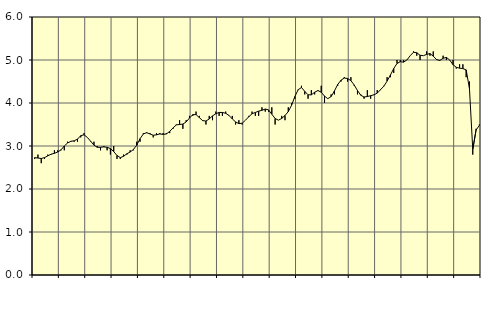
| Category | Piggar | Series 1 |
|---|---|---|
| nan | 2.7 | 2.73 |
| 87.0 | 2.8 | 2.72 |
| 87.0 | 2.6 | 2.71 |
| 87.0 | 2.7 | 2.73 |
| nan | 2.8 | 2.77 |
| 88.0 | 2.8 | 2.81 |
| 88.0 | 2.9 | 2.83 |
| 88.0 | 2.9 | 2.86 |
| nan | 2.9 | 2.91 |
| 89.0 | 2.9 | 3 |
| 89.0 | 3.1 | 3.07 |
| 89.0 | 3.1 | 3.11 |
| nan | 3.1 | 3.12 |
| 90.0 | 3.1 | 3.16 |
| 90.0 | 3.2 | 3.24 |
| 90.0 | 3.3 | 3.26 |
| nan | 3.2 | 3.2 |
| 91.0 | 3.1 | 3.11 |
| 91.0 | 3.1 | 3.02 |
| 91.0 | 3 | 2.97 |
| nan | 2.9 | 2.97 |
| 92.0 | 3 | 2.98 |
| 92.0 | 2.9 | 2.97 |
| 92.0 | 2.8 | 2.94 |
| nan | 3 | 2.87 |
| 93.0 | 2.7 | 2.78 |
| 93.0 | 2.7 | 2.73 |
| 93.0 | 2.8 | 2.76 |
| nan | 2.8 | 2.82 |
| 94.0 | 2.9 | 2.86 |
| 94.0 | 2.9 | 2.92 |
| 94.0 | 3.1 | 3.02 |
| nan | 3.1 | 3.17 |
| 95.0 | 3.3 | 3.28 |
| 95.0 | 3.3 | 3.31 |
| 95.0 | 3.3 | 3.28 |
| nan | 3.2 | 3.25 |
| 96.0 | 3.3 | 3.26 |
| 96.0 | 3.3 | 3.28 |
| 96.0 | 3.3 | 3.27 |
| nan | 3.3 | 3.28 |
| 97.0 | 3.3 | 3.34 |
| 97.0 | 3.4 | 3.42 |
| 97.0 | 3.5 | 3.49 |
| nan | 3.6 | 3.5 |
| 98.0 | 3.4 | 3.51 |
| 98.0 | 3.6 | 3.56 |
| 98.0 | 3.7 | 3.65 |
| nan | 3.7 | 3.73 |
| 99.0 | 3.8 | 3.73 |
| 99.0 | 3.7 | 3.66 |
| 99.0 | 3.6 | 3.59 |
| nan | 3.5 | 3.58 |
| 0.0 | 3.7 | 3.63 |
| 0.0 | 3.6 | 3.7 |
| 0.0 | 3.8 | 3.75 |
| nan | 3.7 | 3.78 |
| 1.0 | 3.7 | 3.78 |
| 1.0 | 3.8 | 3.76 |
| 1.0 | 3.7 | 3.71 |
| nan | 3.7 | 3.63 |
| 2.0 | 3.5 | 3.56 |
| 2.0 | 3.6 | 3.52 |
| 2.0 | 3.5 | 3.53 |
| nan | 3.6 | 3.6 |
| 3.0 | 3.7 | 3.68 |
| 3.0 | 3.8 | 3.75 |
| 3.0 | 3.7 | 3.78 |
| nan | 3.7 | 3.81 |
| 4.0 | 3.9 | 3.83 |
| 4.0 | 3.8 | 3.86 |
| 4.0 | 3.8 | 3.84 |
| nan | 3.9 | 3.74 |
| 5.0 | 3.5 | 3.64 |
| 5.0 | 3.6 | 3.6 |
| 5.0 | 3.7 | 3.64 |
| nan | 3.6 | 3.71 |
| 6.0 | 3.9 | 3.8 |
| 6.0 | 4 | 3.95 |
| 6.0 | 4.1 | 4.15 |
| nan | 4.3 | 4.31 |
| 7.0 | 4.4 | 4.36 |
| 7.0 | 4.2 | 4.27 |
| 7.0 | 4.1 | 4.19 |
| nan | 4.3 | 4.19 |
| 8.0 | 4.2 | 4.25 |
| 8.0 | 4.3 | 4.29 |
| 8.0 | 4.4 | 4.25 |
| nan | 4 | 4.16 |
| 9.0 | 4.1 | 4.1 |
| 9.0 | 4.2 | 4.15 |
| 9.0 | 4.2 | 4.28 |
| nan | 4.4 | 4.43 |
| 10.0 | 4.5 | 4.53 |
| 10.0 | 4.6 | 4.58 |
| 10.0 | 4.5 | 4.57 |
| nan | 4.6 | 4.52 |
| 11.0 | 4.4 | 4.42 |
| 11.0 | 4.2 | 4.29 |
| 11.0 | 4.2 | 4.18 |
| nan | 4.1 | 4.14 |
| 12.0 | 4.3 | 4.15 |
| 12.0 | 4.1 | 4.17 |
| 12.0 | 4.2 | 4.19 |
| nan | 4.3 | 4.23 |
| 13.0 | 4.3 | 4.31 |
| 13.0 | 4.4 | 4.39 |
| 13.0 | 4.6 | 4.51 |
| nan | 4.6 | 4.65 |
| 14.0 | 4.7 | 4.8 |
| 14.0 | 5 | 4.92 |
| 14.0 | 5 | 4.96 |
| nan | 5 | 4.95 |
| 15.0 | 5 | 5 |
| 15.0 | 5.1 | 5.1 |
| 15.0 | 5.2 | 5.18 |
| nan | 5.1 | 5.17 |
| 16.0 | 5 | 5.11 |
| 16.0 | 5.1 | 5.1 |
| 16.0 | 5.2 | 5.13 |
| nan | 5.1 | 5.15 |
| 17.0 | 5.2 | 5.09 |
| 17.0 | 5 | 5.01 |
| 17.0 | 5 | 4.99 |
| nan | 5.1 | 5.04 |
| 18.0 | 5 | 5.06 |
| 18.0 | 5 | 5 |
| 18.0 | 5 | 4.89 |
| nan | 4.8 | 4.83 |
| 19.0 | 4.9 | 4.81 |
| 19.0 | 4.9 | 4.8 |
| 19.0 | 4.6 | 4.77 |
| nan | 4.5 | 4.33 |
| 20.0 | 2.8 | 2.92 |
| 20.0 | 3.4 | 3.37 |
| 20.0 | 3.5 | 3.48 |